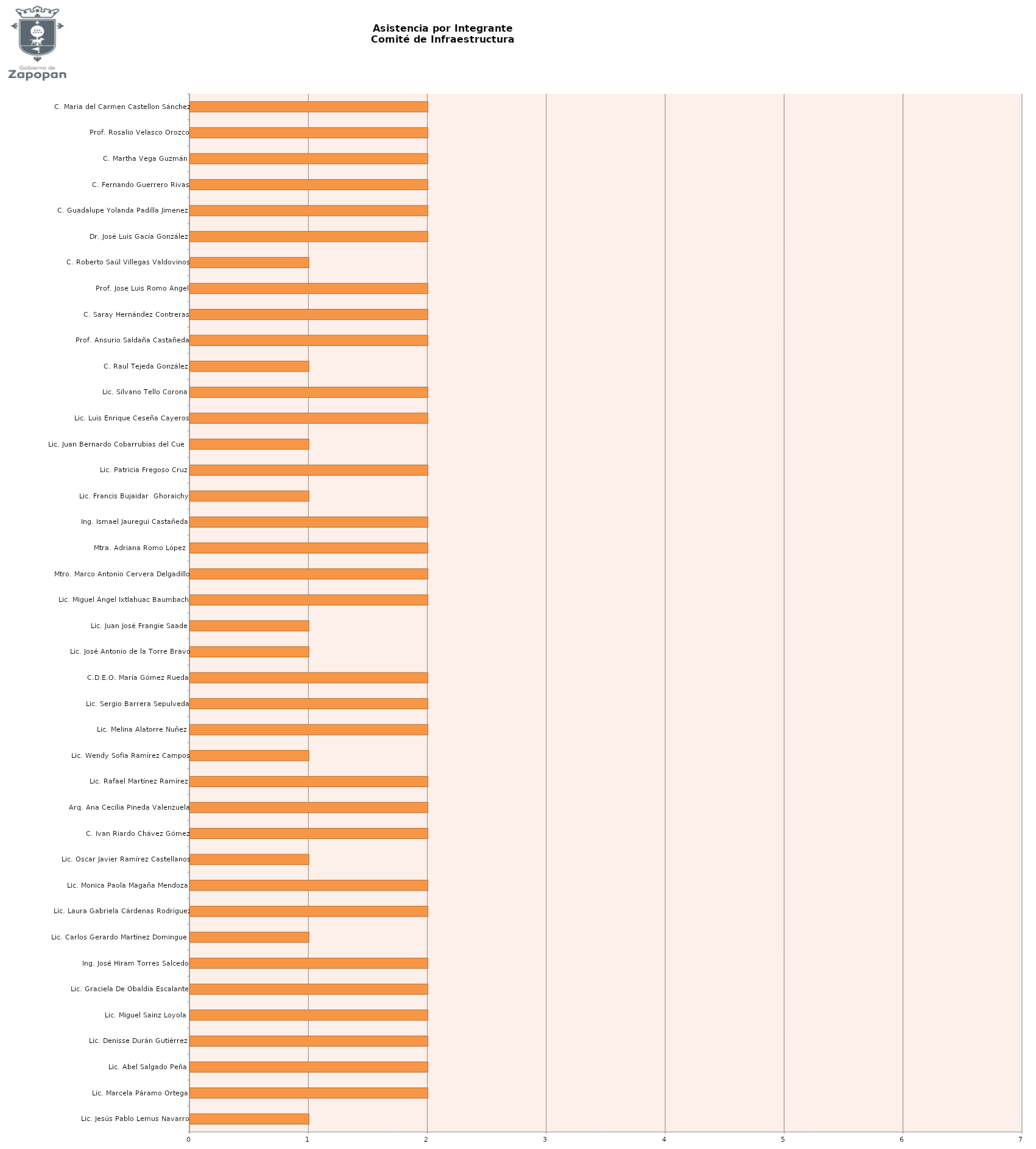
| Category | Series 0 |
|---|---|
| Lic. Jesús Pablo Lemus Navarro | 1 |
| Lic. Marcela Páramo Ortega | 2 |
| Lic. Abel Salgado Peña | 2 |
| Lic. Denisse Durán Gutiérrez | 2 |
| Lic. Miguel Sainz Loyola | 2 |
| Lic. Graciela De Obaldía Escalante | 2 |
| Ing. José Hiram Torres Salcedo | 2 |
| Lic. Carlos Gerardo Martínez Dominguez | 1 |
| Lic. Laura Gabriela Cárdenas Rodríguez | 2 |
| Lic. Monica Paola Magaña Mendoza | 2 |
| Lic. Oscar Javier Ramírez Castellanos | 1 |
| C. Ivan Riardo Chávez Gómez | 2 |
| Arq. Ana Cecilia Pineda Valenzuela | 2 |
| Lic. Rafael Martínez Ramírez | 2 |
| Lic. Wendy Sofia Ramírez Campos | 1 |
| Lic. Melina Alatorre Nuñez | 2 |
| Lic. Sergio Barrera Sepulveda | 2 |
| C.D.E.O. María Gómez Rueda | 2 |
| Lic. José Antonio de la Torre Bravo | 1 |
| Lic. Juan José Frangie Saade | 1 |
| Lic. Miguel Ángel Ixtlahuac Baumbach | 2 |
| Mtro. Marco Antonio Cervera Delgadillo | 2 |
| Mtra. Adriana Romo López  | 2 |
| Ing. Ismael Jauregui Castañeda | 2 |
| Lic. Francis Bujaidar  Ghoraichy | 1 |
| Lic. Patricia Fregoso Cruz | 2 |
| Lic. Juan Bernardo Cobarrubias del Cueto | 1 |
| Lic. Luis Enrique Ceseña Cayeros | 2 |
| Lic. Silvano Tello Corona | 2 |
| C. Raul Tejeda González | 1 |
| Prof. Ansurio Saldaña Castañeda | 2 |
| C. Saray Hernández Contreras | 2 |
| Prof. Jose Luis Romo Ángel | 2 |
| C. Roberto Saúl Villegas Valdovinos | 1 |
| Dr. José Luis Gacía González | 2 |
| C. Guadalupe Yolanda Padilla Jimenez  | 2 |
| C. Fernando Guerrero Rivas | 2 |
| C. Martha Vega Guzmán | 2 |
| Prof. Rosalio Velasco Orozco | 2 |
| C. Maria del Carmen Castellon Sánchez | 2 |